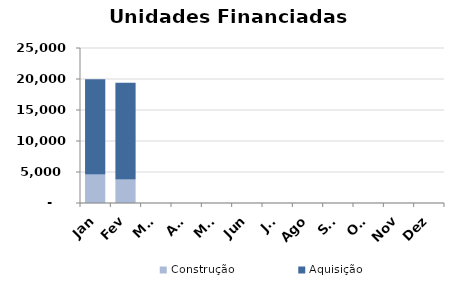
| Category | Construção | Aquisição  |
|---|---|---|
| Jan | 4588 | 15352 |
| Fev | 3778 | 15623 |
| Mar | 0 | 0 |
| Abr | 0 | 0 |
| Mai | 0 | 0 |
| Jun | 0 | 0 |
| Jul | 0 | 0 |
| Ago | 0 | 0 |
| Set | 0 | 0 |
| Out | 0 | 0 |
| Nov | 0 | 0 |
| Dez | 0 | 0 |